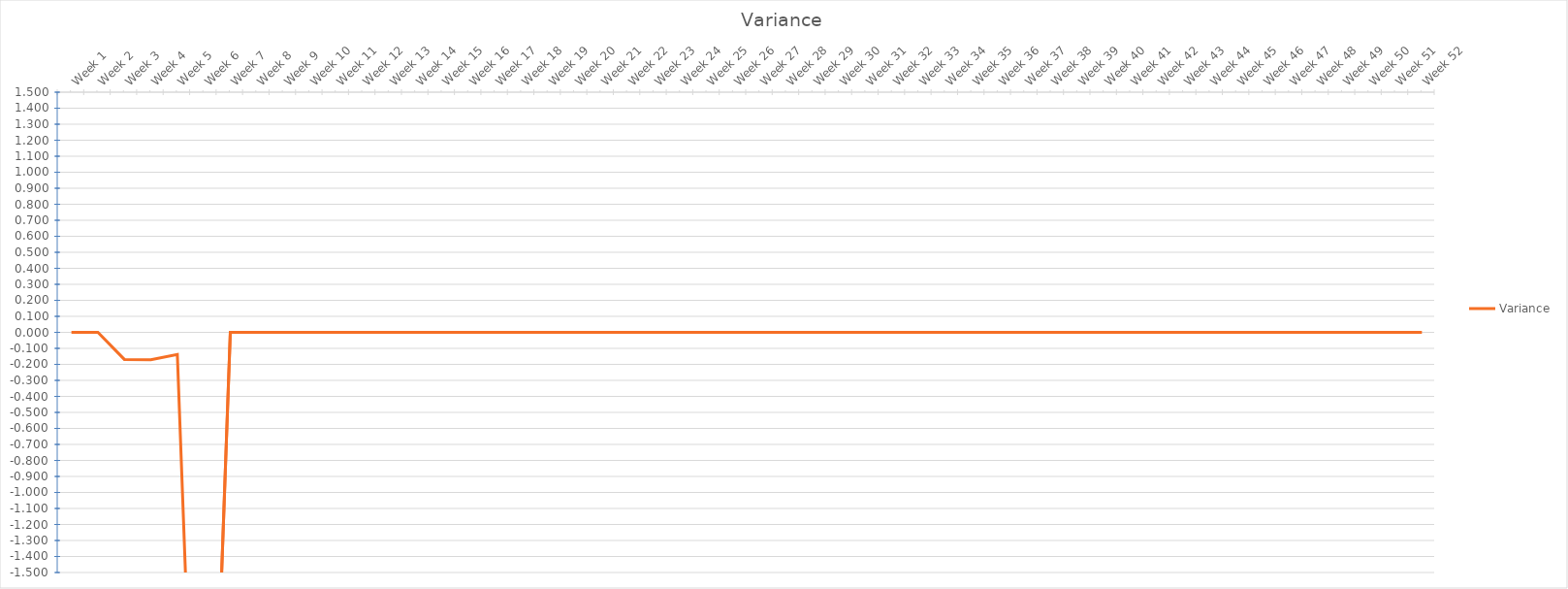
| Category | Variance |
|---|---|
| Week 1 | 0 |
| Week 2 | 0 |
| Week 3 | -0.169 |
| Week 4 | -0.171 |
| Week 5 | -0.138 |
| Week 6 | -4.592 |
| Week 7 | 0 |
| Week 8 | 0 |
| Week 9 | 0 |
| Week 10 | 0 |
| Week 11 | 0 |
| Week 12 | 0 |
| Week 13 | 0 |
| Week 14 | 0 |
| Week 15 | 0 |
| Week 16 | 0 |
| Week 17 | 0 |
| Week 18 | 0 |
| Week 19 | 0 |
| Week 20 | 0 |
| Week 21 | 0 |
| Week 22 | 0 |
| Week 23 | 0 |
| Week 24 | 0 |
| Week 25 | 0 |
| Week 26 | 0 |
| Week 27 | 0 |
| Week 28 | 0 |
| Week 29 | 0 |
| Week 30 | 0 |
| Week 31 | 0 |
| Week 32 | 0 |
| Week 33 | 0 |
| Week 34 | 0 |
| Week 35 | 0 |
| Week 36 | 0 |
| Week 37 | 0 |
| Week 38 | 0 |
| Week 39 | 0 |
| Week 40 | 0 |
| Week 41 | 0 |
| Week 42 | 0 |
| Week 43 | 0 |
| Week 44 | 0 |
| Week 45 | 0 |
| Week 46 | 0 |
| Week 47 | 0 |
| Week 48 | 0 |
| Week 49 | 0 |
| Week 50 | 0 |
| Week 51 | 0 |
| Week 52 | 0 |